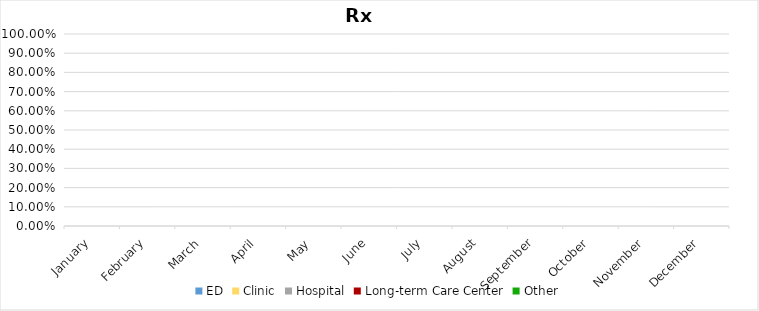
| Category | ED | Clinic | Hospital | Long-term Care Center | Other |
|---|---|---|---|---|---|
| January | 0 | 0 | 0 | 0 | 0 |
| February | 0 | 0 | 0 | 0 | 0 |
| March | 0 | 0 | 0 | 0 | 0 |
| April | 0 | 0 | 0 | 0 | 0 |
| May | 0 | 0 | 0 | 0 | 0 |
| June | 0 | 0 | 0 | 0 | 0 |
| July | 0 | 0 | 0 | 0 | 0 |
| August | 0 | 0 | 0 | 0 | 0 |
| September | 0 | 0 | 0 | 0 | 0 |
| October | 0 | 0 | 0 | 0 | 0 |
| November | 0 | 0 | 0 | 0 | 0 |
| December | 0 | 0 | 0 | 0 | 0 |